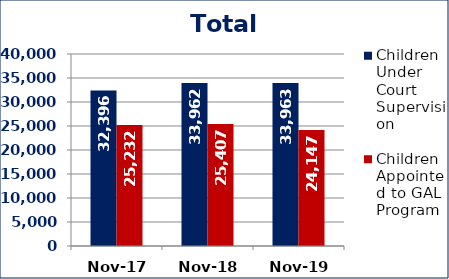
| Category | Children Under Court Supervision  | Children Appointed to GAL Program  |
|---|---|---|
| Nov-17 | 32396 | 25232 |
| Nov-18 | 33962 | 25407 |
| Nov-19 | 33963 | 24147 |